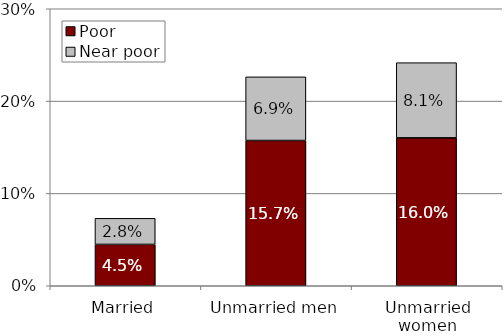
| Category | Poor  | Near poor |
|---|---|---|
| Married | 0.045 | 0.028 |
| Unmarried men | 0.157 | 0.069 |
| Unmarried women | 0.16 | 0.081 |